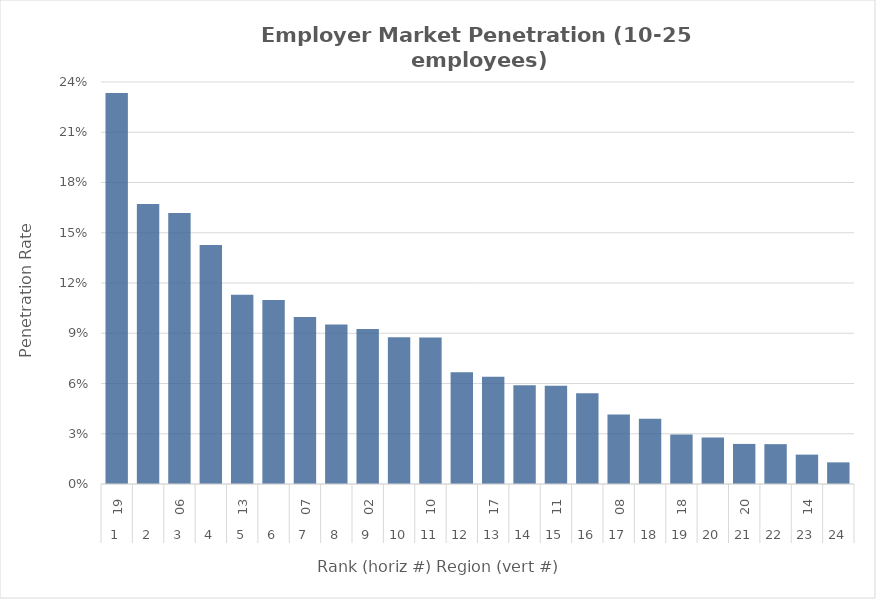
| Category | Rate |
|---|---|
| 0 | 0.233 |
| 1 | 0.167 |
| 2 | 0.162 |
| 3 | 0.143 |
| 4 | 0.113 |
| 5 | 0.11 |
| 6 | 0.1 |
| 7 | 0.095 |
| 8 | 0.093 |
| 9 | 0.088 |
| 10 | 0.087 |
| 11 | 0.067 |
| 12 | 0.064 |
| 13 | 0.059 |
| 14 | 0.059 |
| 15 | 0.054 |
| 16 | 0.041 |
| 17 | 0.039 |
| 18 | 0.03 |
| 19 | 0.028 |
| 20 | 0.024 |
| 21 | 0.024 |
| 22 | 0.018 |
| 23 | 0.013 |